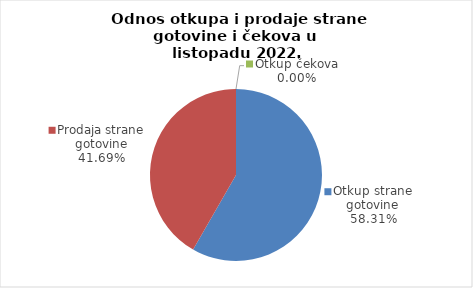
| Category | Series 0 |
|---|---|
| Otkup strane gotovine | 58.308 |
| Prodaja strane gotovine | 41.692 |
| Otkup čekova | 0 |